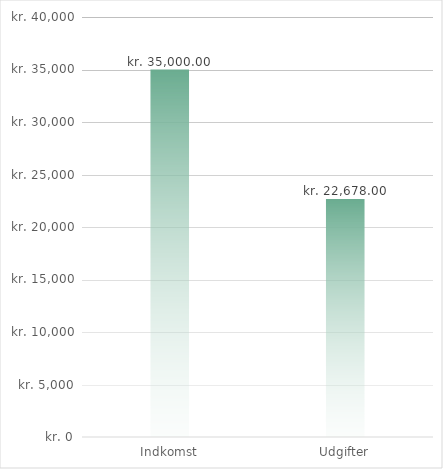
| Category | DiagramData |
|---|---|
| 0 | 35000 |
| 1 | 22678 |